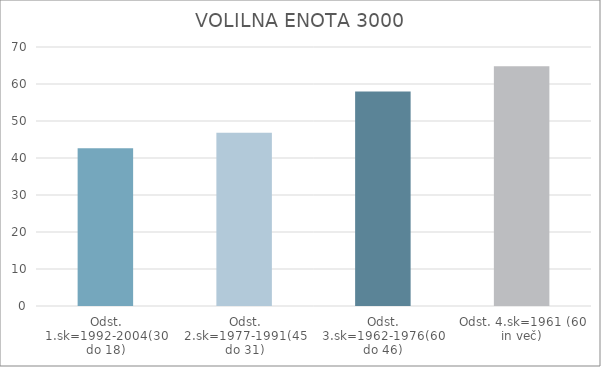
| Category | Series 0 |
|---|---|
| Odst. 1.sk=1992-2004(30 do 18) | 42.62 |
| Odst. 2.sk=1977-1991(45 do 31) | 46.84 |
| Odst. 3.sk=1962-1976(60 do 46) | 57.94 |
| Odst. 4.sk=1961 (60 in več) | 64.82 |